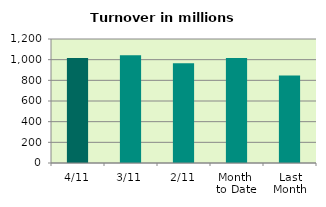
| Category | Series 0 |
|---|---|
| 4/11 | 1016.463 |
| 3/11 | 1043.803 |
| 2/11 | 964.299 |
| Month 
to Date | 1017.143 |
| Last
Month | 847.422 |